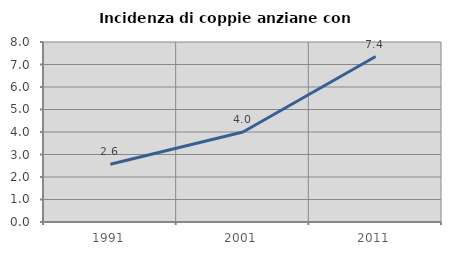
| Category | Incidenza di coppie anziane con figli |
|---|---|
| 1991.0 | 2.564 |
| 2001.0 | 4 |
| 2011.0 | 7.353 |